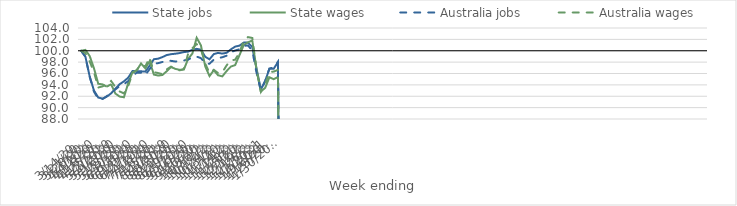
| Category | State jobs | State wages | Australia jobs | Australia wages |
|---|---|---|---|---|
| 14/03/2020 | 100 | 100 | 100 | 100 |
| 21/03/2020 | 98.948 | 100.15 | 98.956 | 99.595 |
| 28/03/2020 | 95.479 | 99.07 | 95.413 | 98.12 |
| 04/04/2020 | 93 | 96.911 | 92.814 | 96.244 |
| 11/04/2020 | 91.776 | 94.186 | 91.522 | 93.536 |
| 18/04/2020 | 91.581 | 94.087 | 91.5 | 93.735 |
| 25/04/2020 | 91.928 | 93.684 | 92.025 | 94.14 |
| 02/05/2020 | 92.508 | 94.118 | 92.519 | 94.693 |
| 09/05/2020 | 93.323 | 92.478 | 93.198 | 93.616 |
| 16/05/2020 | 94.122 | 91.943 | 93.788 | 92.845 |
| 23/05/2020 | 94.626 | 91.822 | 94.146 | 92.504 |
| 30/05/2020 | 95.266 | 94.304 | 94.65 | 93.808 |
| 06/06/2020 | 96.425 | 96.195 | 95.634 | 95.987 |
| 13/06/2020 | 96.419 | 96.543 | 96.135 | 96.641 |
| 20/06/2020 | 96.386 | 97.767 | 96.154 | 97.544 |
| 27/06/2020 | 96.325 | 96.9 | 95.728 | 97.236 |
| 04/07/2020 | 97.381 | 98.162 | 96.767 | 98.815 |
| 11/07/2020 | 98.513 | 95.812 | 97.729 | 96.243 |
| 18/07/2020 | 98.605 | 95.636 | 97.82 | 96.079 |
| 25/07/2020 | 98.888 | 95.737 | 98.028 | 95.887 |
| 01/08/2020 | 99.241 | 96.397 | 98.238 | 96.723 |
| 08/08/2020 | 99.396 | 97.14 | 98.223 | 97.204 |
| 15/08/2020 | 99.478 | 96.821 | 98.112 | 96.712 |
| 22/08/2020 | 99.589 | 96.641 | 98.158 | 96.554 |
| 29/08/2020 | 99.77 | 96.701 | 98.287 | 96.77 |
| 05/09/2020 | 99.847 | 98.549 | 98.443 | 99.477 |
| 12/09/2020 | 100.161 | 99.52 | 98.829 | 100.444 |
| 19/09/2020 | 100.335 | 102.282 | 98.97 | 101.162 |
| 26/09/2020 | 100.185 | 100.935 | 98.7 | 100.248 |
| 03/10/2020 | 98.939 | 97.244 | 97.765 | 97.757 |
| 10/10/2020 | 98.496 | 95.549 | 97.711 | 96.071 |
| 17/10/2020 | 99.411 | 96.565 | 98.435 | 96.645 |
| 24/10/2020 | 99.625 | 95.696 | 98.68 | 96.08 |
| 31/10/2020 | 99.499 | 95.493 | 98.863 | 96.206 |
| 07/11/2020 | 99.639 | 96.439 | 99.129 | 97.432 |
| 14/11/2020 | 100.244 | 97.218 | 99.776 | 98.33 |
| 21/11/2020 | 100.728 | 97.485 | 100.039 | 98.416 |
| 28/11/2020 | 100.898 | 99.22 | 100.264 | 99.694 |
| 05/12/2020 | 101.433 | 100.992 | 100.878 | 101.784 |
| 12/12/2020 | 101.428 | 101.489 | 100.916 | 102.402 |
| 19/12/2020 | 100.634 | 101.801 | 100.035 | 102.249 |
| 26/12/2020 | 96.808 | 96.657 | 96.089 | 96.528 |
| 02/01/2021 | 93.194 | 92.848 | 92.998 | 92.765 |
| 09/01/2021 | 94.66 | 93.462 | 94.651 | 94.062 |
| 16/01/2021 | 96.842 | 95.334 | 96.853 | 96.284 |
| 23/01/2021 | 96.836 | 95.001 | 97.109 | 96.336 |
| 30/01/2021 | 98.006 | 95.396 | 98.068 | 96.635 |